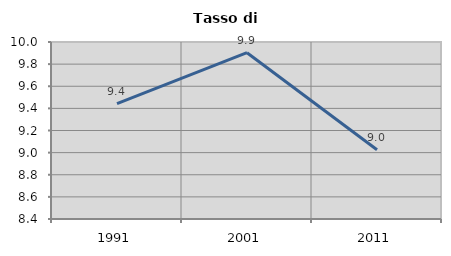
| Category | Tasso di disoccupazione   |
|---|---|
| 1991.0 | 9.443 |
| 2001.0 | 9.903 |
| 2011.0 | 9.026 |